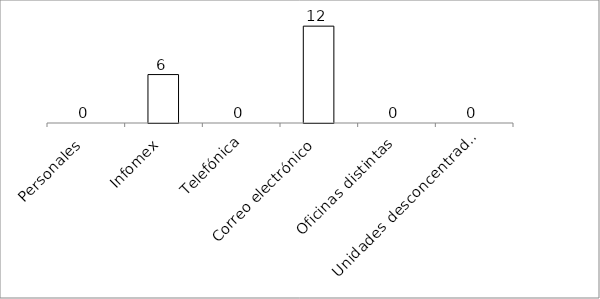
| Category | Series 0 |
|---|---|
| Personales | 0 |
| Infomex | 6 |
| Telefónica | 0 |
| Correo electrónico | 12 |
| Oficinas distintas | 0 |
| Unidades desconcentradas | 0 |